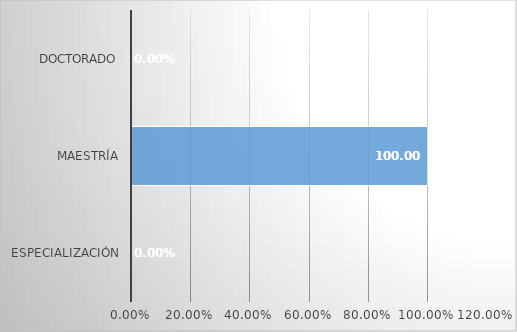
| Category | Series 0 |
|---|---|
| Especialización | 0 |
| Maestría | 1 |
| Doctorado | 0 |